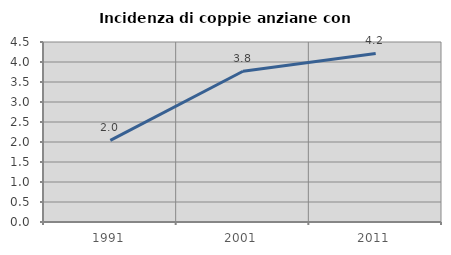
| Category | Incidenza di coppie anziane con figli |
|---|---|
| 1991.0 | 2.042 |
| 2001.0 | 3.77 |
| 2011.0 | 4.213 |